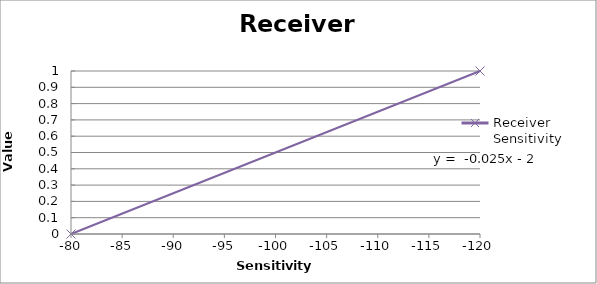
| Category | Receiver Sensitivity |
|---|---|
| -80.0 | 0 |
| nan | 0.2 |
| nan | 0.4 |
| nan | 0.5 |
| nan | 0.6 |
| nan | 0.7 |
| nan | 0.8 |
| nan | 0.85 |
| nan | 0.9 |
| nan | 0.95 |
| -120.0 | 1 |